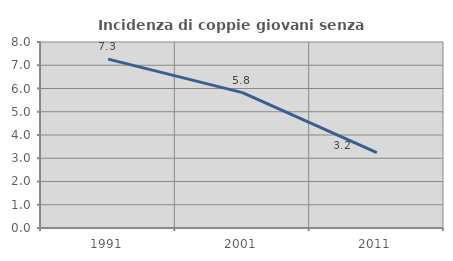
| Category | Incidenza di coppie giovani senza figli |
|---|---|
| 1991.0 | 7.264 |
| 2001.0 | 5.823 |
| 2011.0 | 3.237 |